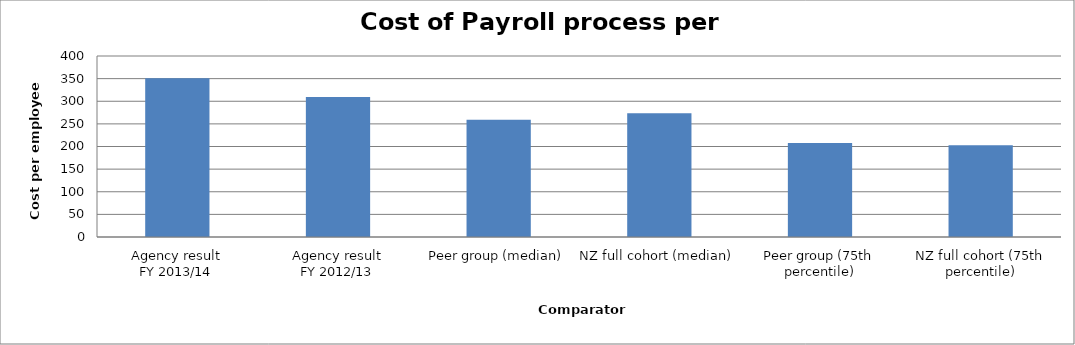
| Category | Result |
|---|---|
| Agency result
FY 2013/14 | 350.595 |
| Agency result
FY 2012/13 | 309.495 |
| Peer group (median) | 259.28 |
| NZ full cohort (median) | 273.448 |
| Peer group (75th percentile) | 207.981 |
| NZ full cohort (75th percentile) | 202.797 |